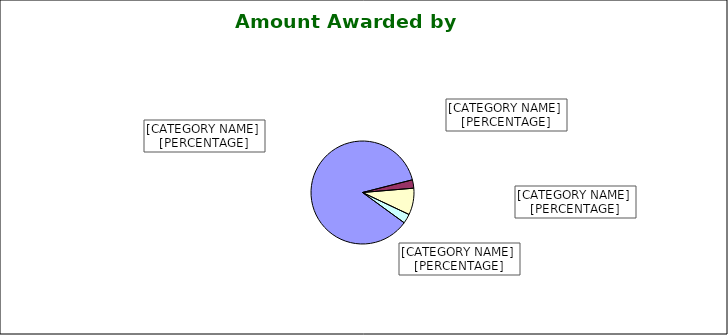
| Category | Series 0 |
|---|---|
| Research $198.0M / | 0.86 |
| Instruction $6.0M / | 0.026 |
| Public Service $19.3M / | 0.084 |
| Extension Service $6.8M / | 0.03 |